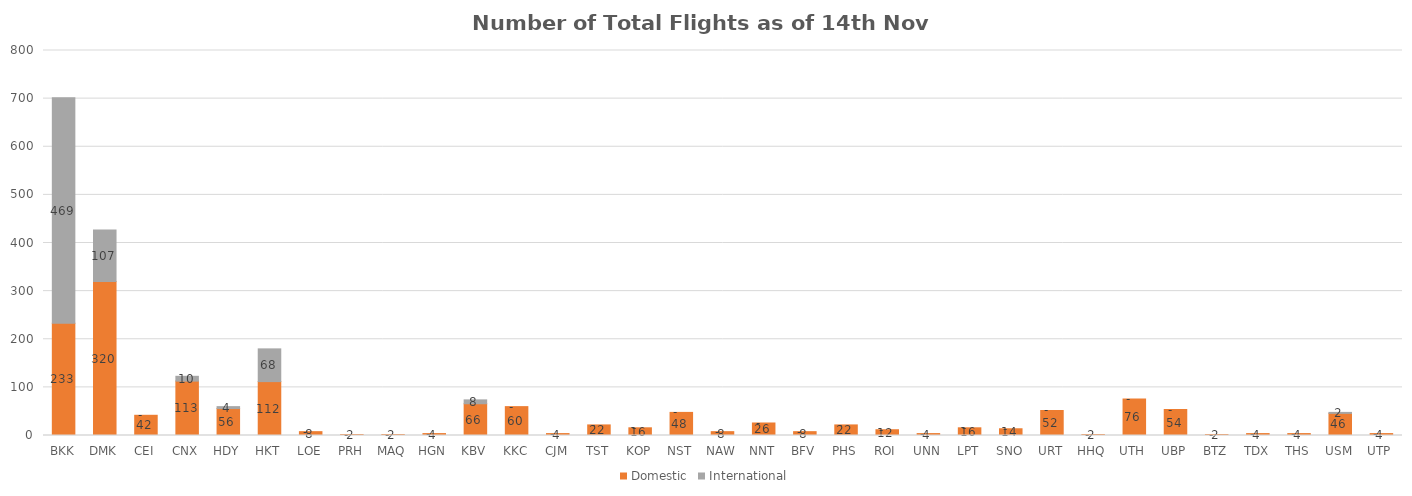
| Category | Domestic | International |
|---|---|---|
| BKK | 233 | 469 |
| DMK | 320 | 107 |
| CEI | 42 | 0 |
| CNX | 113 | 10 |
| HDY | 56 | 4 |
| HKT | 112 | 68 |
| LOE | 8 | 0 |
| PRH | 2 | 0 |
| MAQ | 2 | 0 |
| HGN | 4 | 0 |
| KBV | 66 | 8 |
| KKC | 60 | 0 |
| CJM | 4 | 0 |
| TST | 22 | 0 |
| KOP | 16 | 0 |
| NST | 48 | 0 |
| NAW | 8 | 0 |
| NNT | 26 | 0 |
| BFV | 8 | 0 |
| PHS | 22 | 0 |
| ROI | 12 | 0 |
| UNN | 4 | 0 |
| LPT | 16 | 0 |
| SNO | 14 | 0 |
| URT | 52 | 0 |
| HHQ | 2 | 0 |
| UTH | 76 | 0 |
| UBP | 54 | 0 |
| BTZ | 2 | 0 |
| TDX | 4 | 0 |
| THS | 4 | 0 |
| USM | 46 | 2 |
| UTP | 4 | 0 |